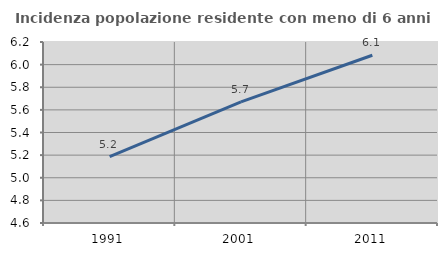
| Category | Incidenza popolazione residente con meno di 6 anni |
|---|---|
| 1991.0 | 5.187 |
| 2001.0 | 5.671 |
| 2011.0 | 6.083 |